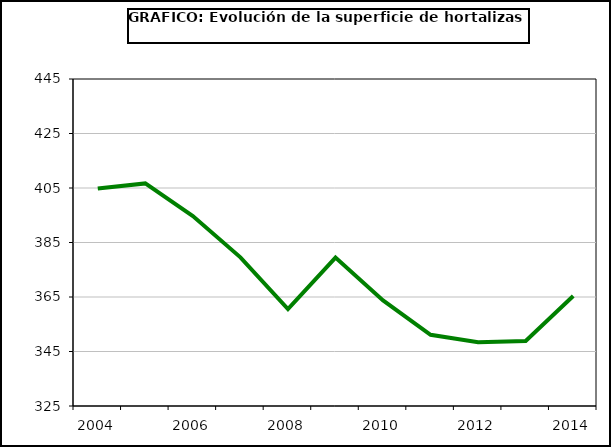
| Category | superficie |
|---|---|
| 2004.0 | 404.787 |
| 2005.0 | 406.688 |
| 2006.0 | 394.718 |
| 2007.0 | 379.564 |
| 2008.0 | 360.539 |
| 2009.0 | 379.479 |
| 2010.0 | 363.729 |
| 2011.0 | 351.145 |
| 2012.0 | 348.359 |
| 2013.0 | 348.853 |
| 2014.0 | 365.385 |